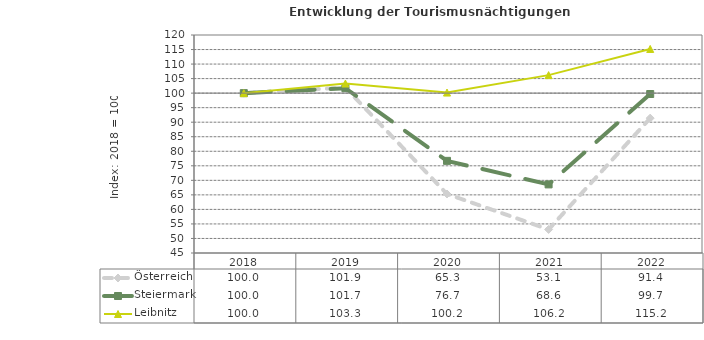
| Category | Österreich | Steiermark | Leibnitz |
|---|---|---|---|
| 2022.0 | 91.4 | 99.7 | 115.2 |
| 2021.0 | 53.1 | 68.6 | 106.2 |
| 2020.0 | 65.3 | 76.7 | 100.2 |
| 2019.0 | 101.9 | 101.7 | 103.3 |
| 2018.0 | 100 | 100 | 100 |